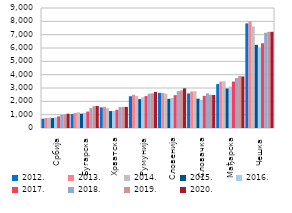
| Category | 2012.  | 2013. | 2014. | 2015. | 2016. | 2017. | 2018. | 2019. | 2020. |
|---|---|---|---|---|---|---|---|---|---|
| Србија | 698 | 752 | 784 | 743 | 801 | 866 | 996 | 1021 | 1067 |
| Бугарска | 1038 | 1128 | 1175 | 1074 | 1134 | 1234 | 1495 | 1641 | 1651 |
| Хрватска | 1545 | 1591 | 1489 | 1270 | 1287 | 1367 | 1570 | 1583 | 1584 |
| Румунија | 2381 | 2491 | 2414 | 2167 | 2313 | 2395 | 2573 | 2604 | 2710 |
| Словенија | 2639 | 2626 | 2574 | 2192 | 2251 | 2462 | 2765 | 2819 | 2977 |
| Словачка | 2591 | 2741 | 2761 | 2198 | 2106 | 2410 | 2604 | 2490 | 2477 |
| Мађарска | 3297 | 3484 | 3505 | 2964 | 3108 | 3484 | 3745 | 3909 | 3868 |
| Чешка | 7846 | 7998 | 7608 | 6238 | 6009 | 6356 | 7144 | 7215 | 7215 |